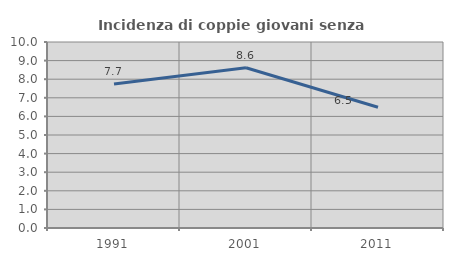
| Category | Incidenza di coppie giovani senza figli |
|---|---|
| 1991.0 | 7.748 |
| 2001.0 | 8.613 |
| 2011.0 | 6.49 |